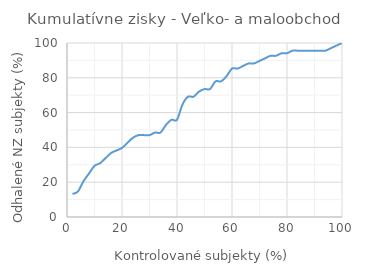
| Category | Veľko- a maloobchod |
|---|---|
| 2.0 | 13.235 |
| 4.0 | 14.706 |
| 6.0 | 20.588 |
| 8.0 | 25 |
| 10.0 | 29.412 |
| 12.0 | 30.882 |
| 14.0 | 33.824 |
| 16.0 | 36.765 |
| 18.0 | 38.235 |
| 20.0 | 39.706 |
| 22.0 | 42.647 |
| 24.0 | 45.588 |
| 26.0 | 47.059 |
| 28.0 | 47.059 |
| 30.0 | 47.059 |
| 32.0 | 48.529 |
| 34.0 | 48.529 |
| 36.0 | 52.941 |
| 38.0 | 55.882 |
| 40.0 | 55.882 |
| 42.0 | 64.706 |
| 44.0 | 69.118 |
| 46.0 | 69.118 |
| 48.0 | 72.059 |
| 50.0 | 73.529 |
| 52.0 | 73.529 |
| 54.0 | 77.941 |
| 56.0 | 77.941 |
| 58.0 | 80.882 |
| 60.0 | 85.294 |
| 62.0 | 85.294 |
| 64.0 | 86.765 |
| 66.0 | 88.235 |
| 68.0 | 88.235 |
| 70.0 | 89.706 |
| 72.0 | 91.176 |
| 74.0 | 92.647 |
| 76.0 | 92.647 |
| 78.0 | 94.118 |
| 80.0 | 94.118 |
| 82.0 | 95.588 |
| 84.0 | 95.588 |
| 86.0 | 95.588 |
| 88.0 | 95.588 |
| 90.0 | 95.588 |
| 92.0 | 95.588 |
| 94.0 | 95.588 |
| 96.0 | 97.059 |
| 98.0 | 98.529 |
| 100.0 | 100 |